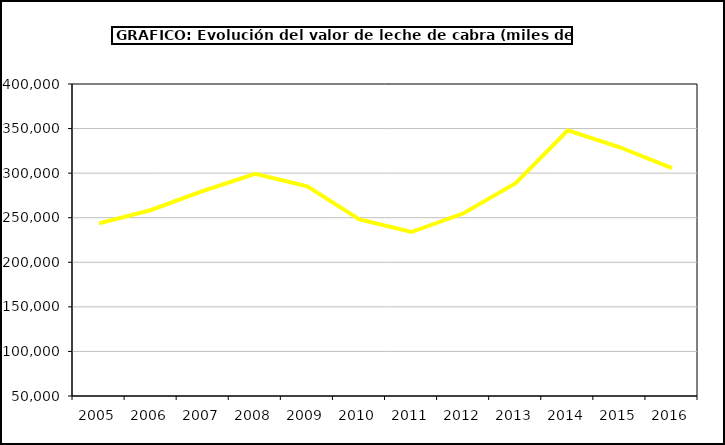
| Category | Leche de cabra |
|---|---|
| 2005.0 | 243629.865 |
| 2006.0 | 258652.812 |
| 2007.0 | 280100.354 |
| 2008.0 | 299168.815 |
| 2009.0 | 285112.802 |
| 2010.0 | 248183.34 |
| 2011.0 | 233957.713 |
| 2012.0 | 254951.239 |
| 2013.0 | 288752.444 |
| 2014.0 | 347968.832 |
| 2015.0 | 329025.351 |
| 2016.0 | 305546.706 |